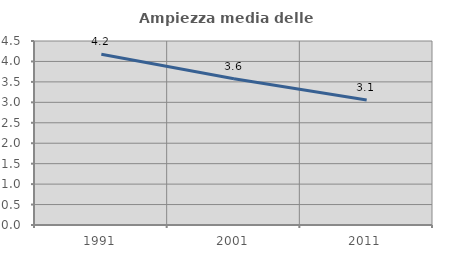
| Category | Ampiezza media delle famiglie |
|---|---|
| 1991.0 | 4.174 |
| 2001.0 | 3.577 |
| 2011.0 | 3.056 |